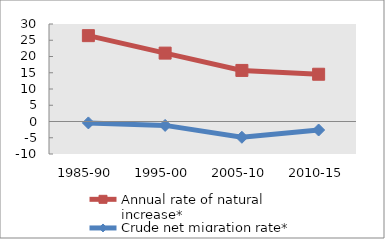
| Category | Annual rate of natural increase* | Crude net migration rate* |
|---|---|---|
| 1985-90 | 26.414 | -0.435 |
| 1995-00 | 21.042 | -1.199 |
| 2005-10 | 15.716 | -4.854 |
| 2010-15 | 14.543 | -2.62 |